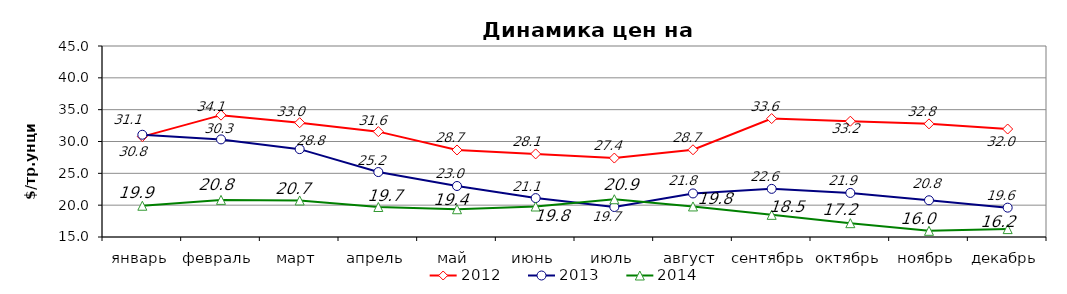
| Category | 2012 | 2013 | 2014 |
|---|---|---|---|
| январь | 30.77 | 31.06 | 19.91 |
| февраль | 34.14 | 30.33 | 20.83 |
| март | 32.95 | 28.8 | 20.74 |
| апрель | 31.55 | 25.2 | 19.71 |
| май | 28.67 | 23.01 | 19.36 |
| июнь | 28.05 | 21.11 | 19.79 |
| июль | 27.4 | 19.71 | 20.93 |
| август | 28.7 | 21.84 | 19.8 |
| сентябрь | 33.6 | 22.56 | 18.48 |
| октябрь | 33.19 | 21.92 | 17.17 |
| ноябрь | 32.77 | 20.77 | 15.97 |
| декабрь | 31.96 | 19.61 | 16.24 |